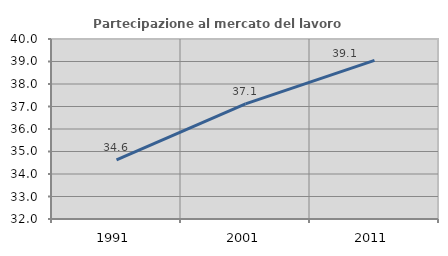
| Category | Partecipazione al mercato del lavoro  femminile |
|---|---|
| 1991.0 | 34.625 |
| 2001.0 | 37.119 |
| 2011.0 | 39.053 |